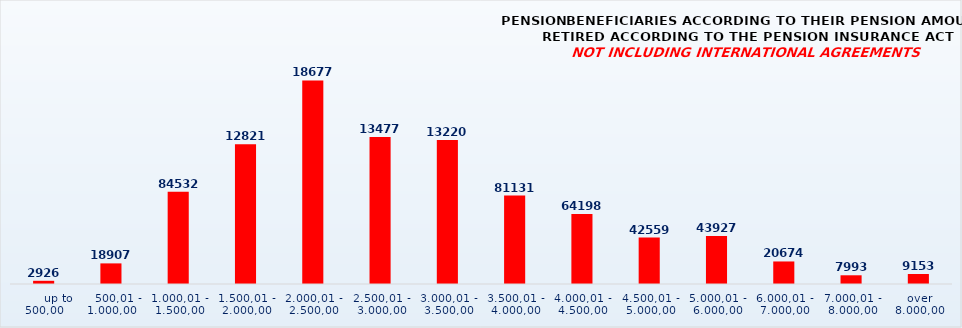
| Category | PENSION BENEFICIARIES ACCORDING TO TYPES AND AMOUNTS OF PENSION, RETIRED ACCORDING TO THE PENSION INSURANCE ACT
NOT INCLUDING INTERNATIONAL AGREEMENTS |
|---|---|
|       up to 500,00 | 2926 |
|    500,01 - 1.000,00 | 18907 |
| 1.000,01 - 1.500,00 | 84532 |
| 1.500,01 - 2.000,00 | 128215 |
| 2.000,01 - 2.500,00 | 186774 |
| 2.500,01 - 3.000,00 | 134775 |
| 3.000,01 - 3.500,00 | 132201 |
| 3.500,01 - 4.000,00 | 81131 |
| 4.000,01 - 4.500,00 | 64198 |
| 4.500,01 - 5.000,00 | 42559 |
| 5.000,01 - 6.000,00 | 43927 |
| 6.000,01 - 7.000,00 | 20674 |
| 7.000,01 - 8.000,00 | 7993 |
|  over  8.000,00 | 9153 |